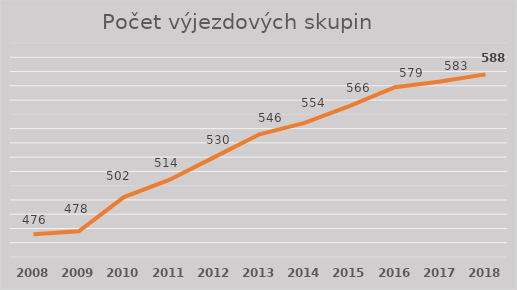
| Category | Počet výjezdových skupin |
|---|---|
| 2008.0 | 476 |
| 2009.0 | 478 |
| 2010.0 | 502 |
| 2011.0 | 514 |
| 2012.0 | 530 |
| 2013.0 | 546 |
| 2014.0 | 554 |
| 2015.0 | 566 |
| 2016.0 | 579 |
| 2017.0 | 583 |
| 2018.0 | 588 |